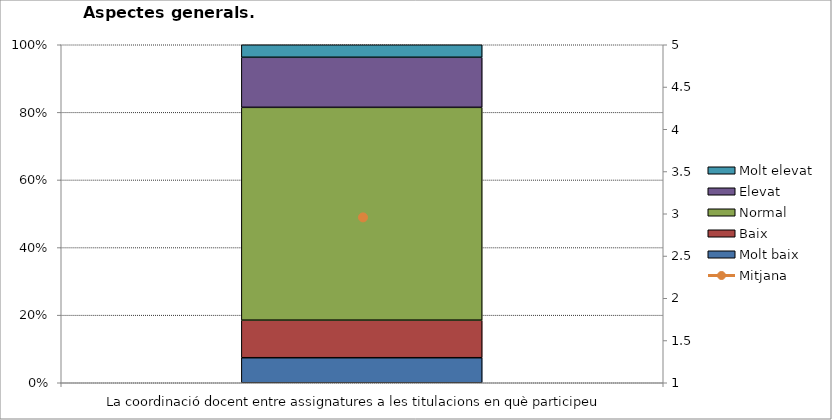
| Category | Molt baix | Baix | Normal  | Elevat | Molt elevat |
|---|---|---|---|---|---|
| La coordinació docent entre assignatures a les titulacions en què participeu | 2 | 3 | 17 | 4 | 1 |